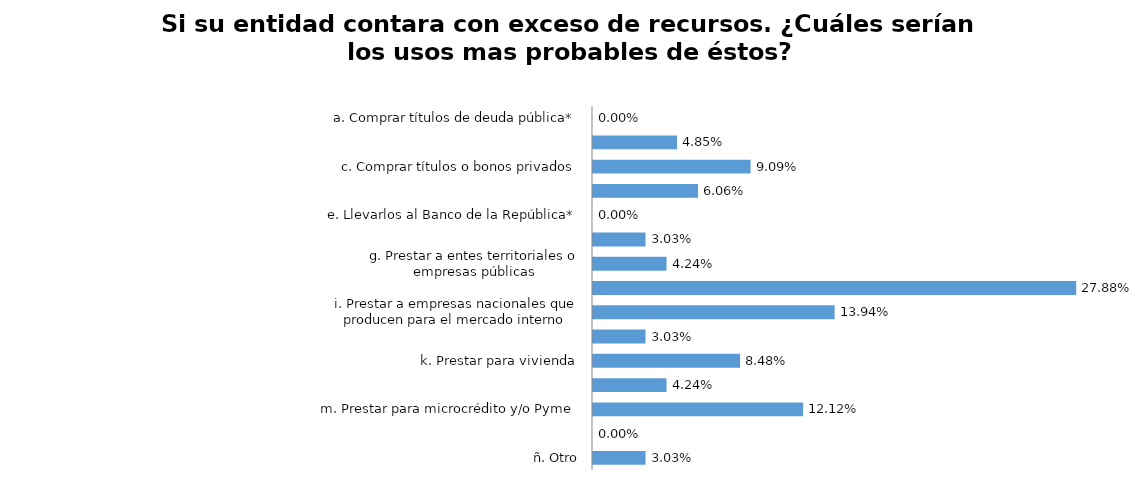
| Category | Series 0 |
|---|---|
| a. Comprar títulos de deuda pública* | 0 |
| b. Comprar títulos o bonos hipotecarios | 0.048 |
| c. Comprar títulos o bonos privados | 0.091 |
| d. Prestar a entidades financieras | 0.061 |
| e. Llevarlos al Banco de la República* | 0 |
| f. Prestar a empresas con inversión extranjera | 0.03 |
| g. Prestar a entes territoriales o empresas públicas | 0.042 |
| h. Prestar para consumo | 0.279 |
| i. Prestar a empresas nacionales que producen para el mercado interno | 0.139 |
| j. Prestar a constructores | 0.03 |
| k. Prestar para vivienda | 0.085 |
| l. Prestar a empresas nacionales que producen en una alta proporción para el mercado externo | 0.042 |
| m. Prestar para microcrédito y/o Pyme | 0.121 |
| n. Aumentar la posición propia en moneda extranjera | 0 |
| ñ. Otro | 0.03 |